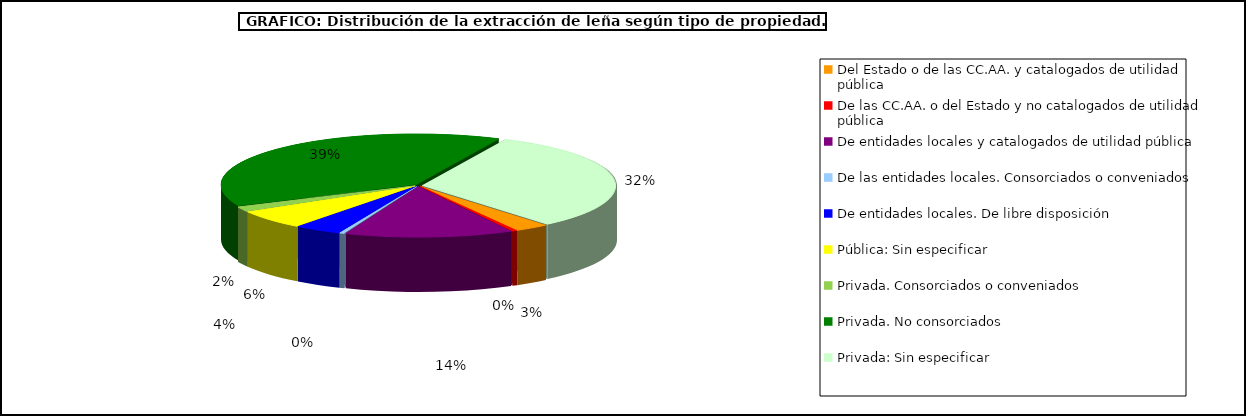
| Category | Series 0 |
|---|---|
| Del Estado o de las CC.AA. y catalogados de utilidad pública | 52900.89 |
| De las CC.AA. o del Estado y no catalogados de utilidad pública | 7137.19 |
| De entidades locales y catalogados de utilidad pública | 258795.99 |
| De las entidades locales. Consorciados o conveniados | 7618.57 |
| De entidades locales. De libre disposición | 72288.03 |
| Pública: Sin especificar | 114019 |
| Privada. Consorciados o conveniados | 29554.18 |
| Privada. No consorciados | 720488.21 |
| Privada: Sin especificar | 591242.73 |